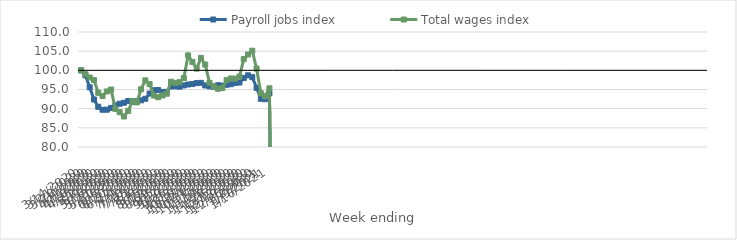
| Category | Payroll jobs index | Total wages index |
|---|---|---|
| 14/03/2020 | 100 | 100 |
| 21/03/2020 | 98.694 | 98.988 |
| 28/03/2020 | 95.58 | 98.118 |
| 04/04/2020 | 92.386 | 97.463 |
| 11/04/2020 | 90.481 | 94.146 |
| 18/04/2020 | 89.718 | 93.297 |
| 25/04/2020 | 89.736 | 94.489 |
| 02/05/2020 | 90.196 | 94.985 |
| 09/05/2020 | 90.876 | 89.9 |
| 16/05/2020 | 91.28 | 89.084 |
| 23/05/2020 | 91.544 | 87.96 |
| 30/05/2020 | 91.982 | 89.431 |
| 06/06/2020 | 91.789 | 91.981 |
| 13/06/2020 | 91.935 | 91.626 |
| 20/06/2020 | 92.174 | 95.05 |
| 27/06/2020 | 92.587 | 97.382 |
| 04/07/2020 | 93.958 | 96.414 |
| 11/07/2020 | 94.806 | 93.42 |
| 18/07/2020 | 94.879 | 92.992 |
| 25/07/2020 | 94.371 | 93.437 |
| 01/08/2020 | 94.391 | 93.89 |
| 08/08/2020 | 95.783 | 97.034 |
| 15/08/2020 | 95.821 | 96.715 |
| 22/08/2020 | 95.742 | 96.928 |
| 29/08/2020 | 96.064 | 97.996 |
| 05/09/2020 | 96.308 | 103.902 |
| 12/09/2020 | 96.43 | 102.208 |
| 19/09/2020 | 96.67 | 100.448 |
| 26/09/2020 | 96.734 | 103.235 |
| 03/10/2020 | 96.053 | 101.506 |
| 10/10/2020 | 95.815 | 96.74 |
| 17/10/2020 | 95.711 | 95.832 |
| 24/10/2020 | 96.119 | 95.194 |
| 31/10/2020 | 96.006 | 95.385 |
| 07/11/2020 | 96.236 | 97.44 |
| 14/11/2020 | 96.384 | 97.879 |
| 21/11/2020 | 96.713 | 97.82 |
| 28/11/2020 | 96.818 | 98.358 |
| 05/12/2020 | 97.984 | 102.925 |
| 12/12/2020 | 98.7 | 104.129 |
| 19/12/2020 | 98.215 | 105.117 |
| 26/12/2020 | 95.446 | 100.452 |
| 02/01/2021 | 92.569 | 94.006 |
| 09/01/2021 | 92.459 | 93.253 |
| 16/01/2021 | 93.991 | 95.31 |